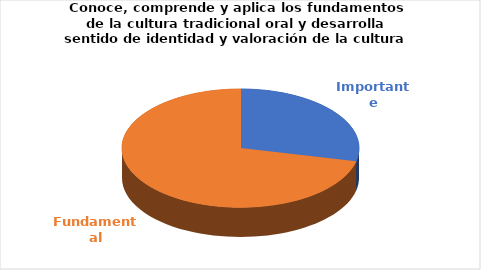
| Category | Series 0 |
|---|---|
| Importante | 4 |
| Fundamental | 10 |